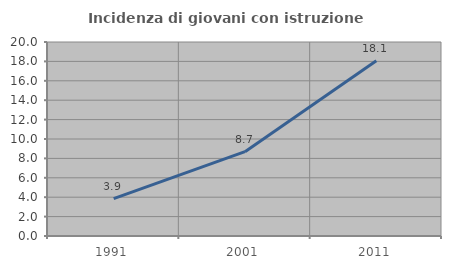
| Category | Incidenza di giovani con istruzione universitaria |
|---|---|
| 1991.0 | 3.858 |
| 2001.0 | 8.696 |
| 2011.0 | 18.065 |